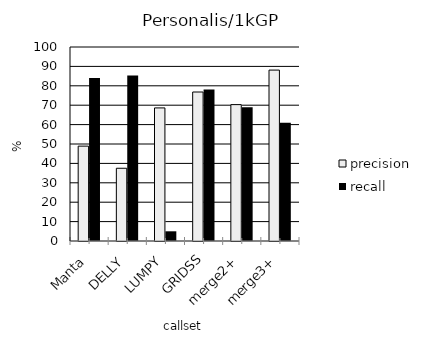
| Category | precision | recall |
|---|---|---|
| Manta | 48.9 | 84 |
| DELLY | 37.5 | 85.3 |
| LUMPY | 68.6 | 5 |
| GRIDSS | 76.8 | 78.1 |
| merge2+ | 70.3 | 69 |
| merge3+ | 88.1 | 60.9 |